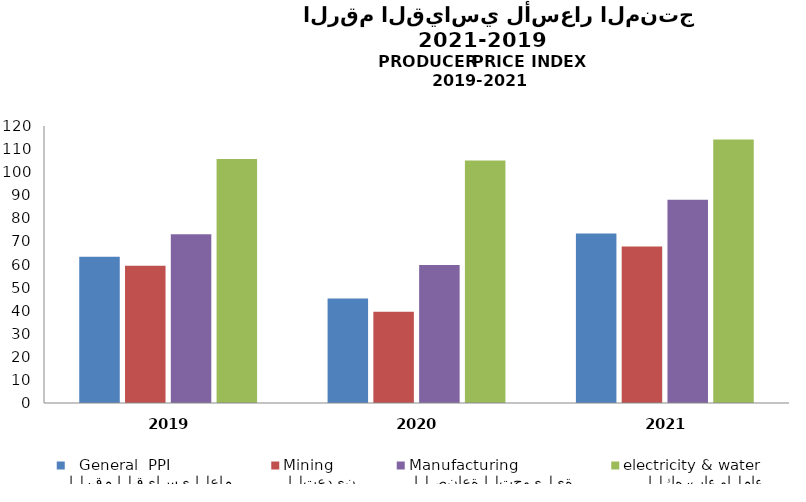
| Category | الرقم القياسي العام
  General  PPI |  التعدين
Mining |  الصناعة التحويلية
Manufacturing |      الكهرباء والماء
electricity & water |
|---|---|---|---|---|
| 2019.0 | 63.331 | 59.411 | 73.133 | 105.708 |
| 2020.0 | 45.293 | 39.519 | 59.782 | 105.084 |
| 2021.0 | 73.428 | 67.757 | 88.009 | 114.145 |